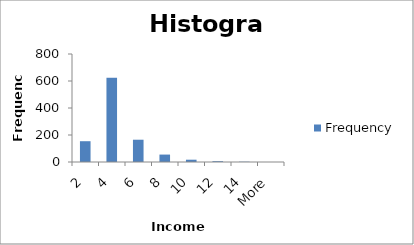
| Category | Frequency |
|---|---|
| 2 | 154 |
| 4 | 624 |
| 6 | 165 |
| 8 | 55 |
| 10 | 17 |
| 12 | 6 |
| 14 | 2 |
| More | 0 |